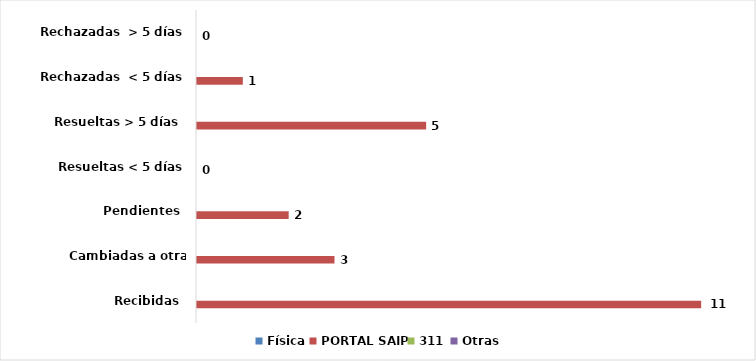
| Category | Física | PORTAL SAIP | 311 | Otras |
|---|---|---|---|---|
| Recibidas  | 0 | 11 | 0 | 0 |
| Cambiadas a otra institución | 0 | 3 | 0 | 0 |
| Pendientes  | 0 | 2 | 0 | 0 |
| Resueltas < 5 días | 0 | 0 | 0 | 0 |
| Resueltas > 5 días  | 0 | 5 | 0 | 0 |
| Rechazadas  < 5 días | 0 | 1 | 0 | 0 |
| Rechazadas  > 5 días | 0 | 0 | 0 | 0 |